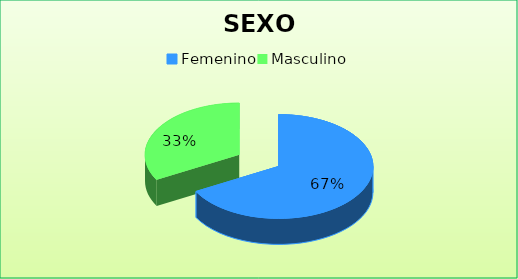
| Category | Series 0 |
|---|---|
| Femenino | 0.67 |
| Masculino | 0.33 |